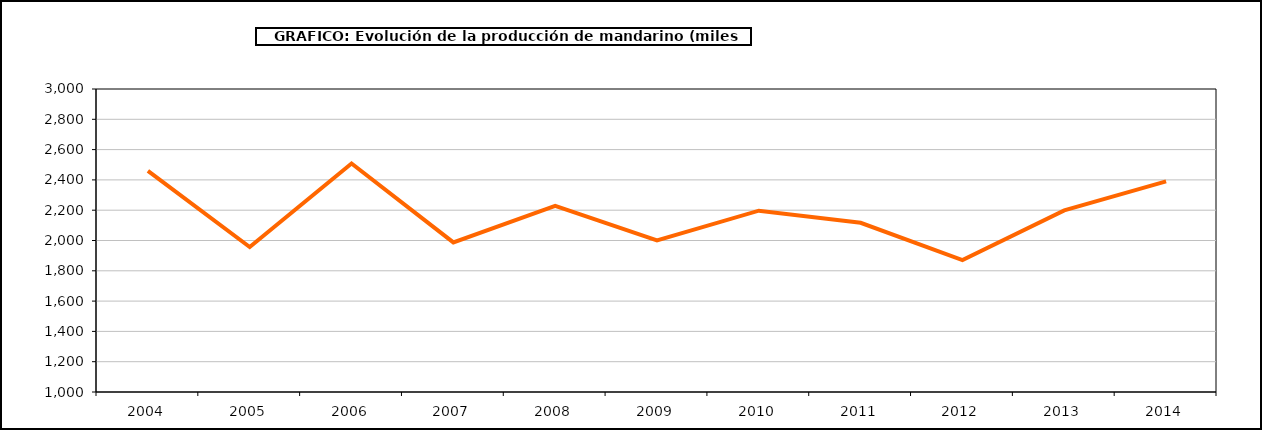
| Category | producción |
|---|---|
| 2004.0 | 2459.82 |
| 2005.0 | 1956.923 |
| 2006.0 | 2508.049 |
| 2007.0 | 1987.432 |
| 2008.0 | 2227.916 |
| 2009.0 | 2000.149 |
| 2010.0 | 2196.89 |
| 2011.0 | 2117.119 |
| 2012.0 | 1871.265 |
| 2013.0 | 2198.926 |
| 2014.0 | 2389.894 |